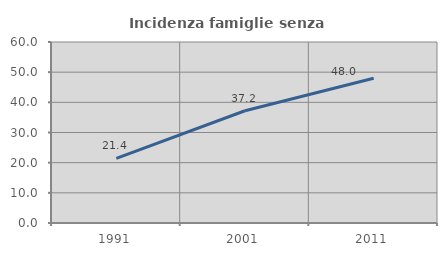
| Category | Incidenza famiglie senza nuclei |
|---|---|
| 1991.0 | 21.429 |
| 2001.0 | 37.209 |
| 2011.0 | 48 |